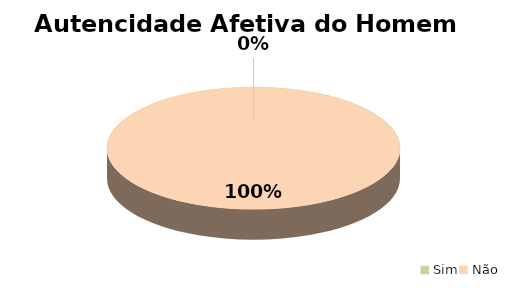
| Category | Series 0 |
|---|---|
| Sim | 0 |
| Não | 25 |